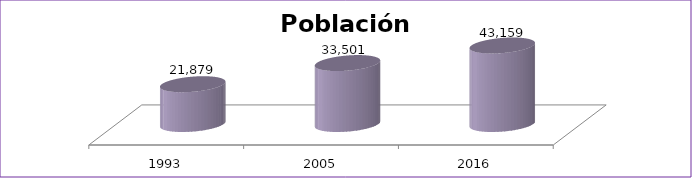
| Category | Población Total |
|---|---|
| 1993 | 21879 |
| 2005 | 33501 |
| 2016 | 43159 |